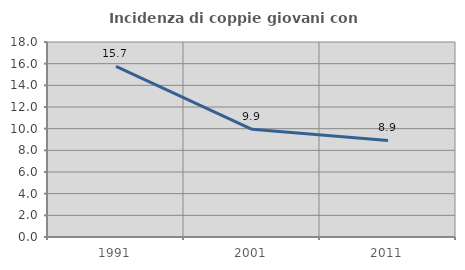
| Category | Incidenza di coppie giovani con figli |
|---|---|
| 1991.0 | 15.748 |
| 2001.0 | 9.945 |
| 2011.0 | 8.914 |